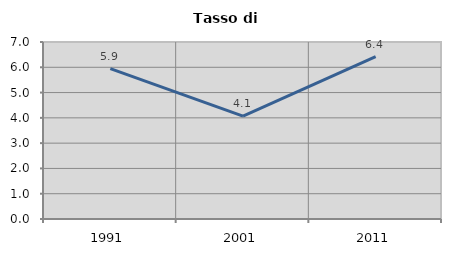
| Category | Tasso di disoccupazione   |
|---|---|
| 1991.0 | 5.944 |
| 2001.0 | 4.065 |
| 2011.0 | 6.421 |